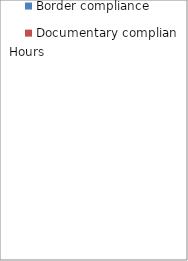
| Category | Border compliance | Documentary compliance |
|---|---|---|
| 0 | 16 | 10 |
| 1 | 57.98 | 58.56 |
| 2 | 24 | 14 |
| 3 | 63.7 | 75.24 |